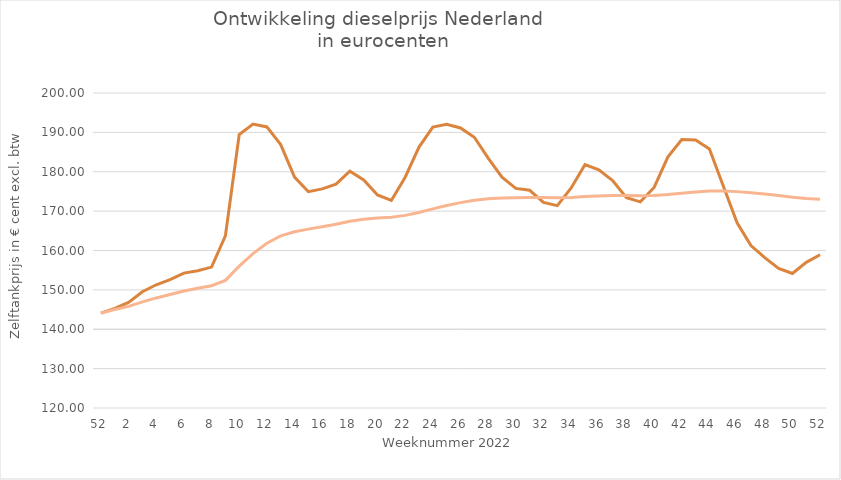
| Category | 52 |
|---|---|
| 52.0 | 144.1 |
| 1.0 | 145.019 |
| 2.0 | 145.805 |
| 3.0 | 146.939 |
| 4.0 | 147.957 |
| 5.0 | 148.835 |
| 6.0 | 149.697 |
| 7.0 | 150.403 |
| 8.0 | 151.053 |
| 9.0 | 152.415 |
| 10.0 | 156.013 |
| 11.0 | 159.209 |
| 12.0 | 161.828 |
| 13.0 | 163.715 |
| 14.0 | 164.759 |
| 15.0 | 165.425 |
| 16.0 | 166.053 |
| 17.0 | 166.677 |
| 18.0 | 167.413 |
| 19.0 | 167.957 |
| 20.0 | 168.26 |
| 21.0 | 168.469 |
| 22.0 | 168.924 |
| 23.0 | 169.669 |
| 24.0 | 170.562 |
| 25.0 | 171.412 |
| 26.0 | 172.162 |
| 27.0 | 172.77 |
| 28.0 | 173.148 |
| 29.0 | 173.334 |
| 30.0 | 173.414 |
| 31.0 | 173.474 |
| 32.0 | 173.436 |
| 33.0 | 173.375 |
| 34.0 | 173.448 |
| 35.0 | 173.685 |
| 36.0 | 173.872 |
| 37.0 | 173.977 |
| 38.0 | 173.962 |
| 39.0 | 173.921 |
| 40.0 | 173.973 |
| 41.0 | 174.211 |
| 42.0 | 174.541 |
| 43.0 | 174.853 |
| 44.0 | 175.1 |
| 45.0 | 175.128 |
| 46.0 | 174.953 |
| 47.0 | 174.663 |
| 48.0 | 174.322 |
| 49.0 | 173.939 |
| 50.0 | 173.546 |
| 51.0 | 173.223 |
| 52.0 | 172.988 |